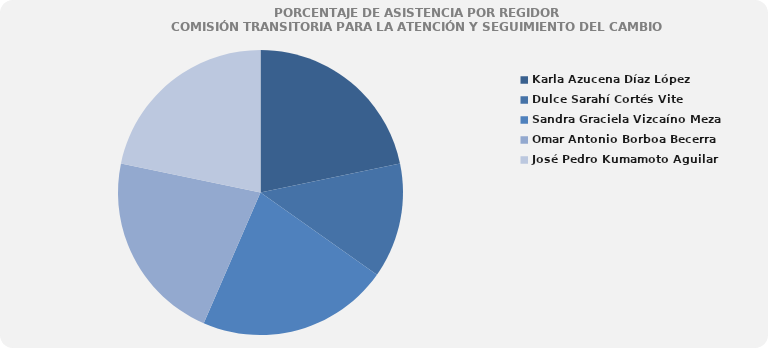
| Category | Series 0 |
|---|---|
| Karla Azucena Díaz López | 100 |
| Dulce Sarahí Cortés Vite | 60 |
| Sandra Graciela Vizcaíno Meza | 100 |
| Omar Antonio Borboa Becerra | 100 |
| José Pedro Kumamoto Aguilar | 100 |